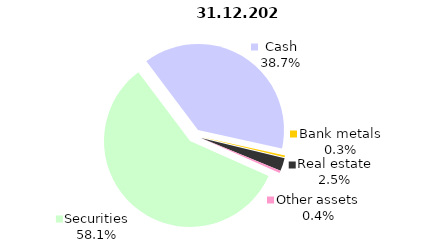
| Category | 12.31.2020 |
|---|---|
| Securities | 2050.228 |
| Cash | 1366.312 |
| Bank metals | 11.009 |
| Real estate | 87.027 |
| Other assets | 15.358 |